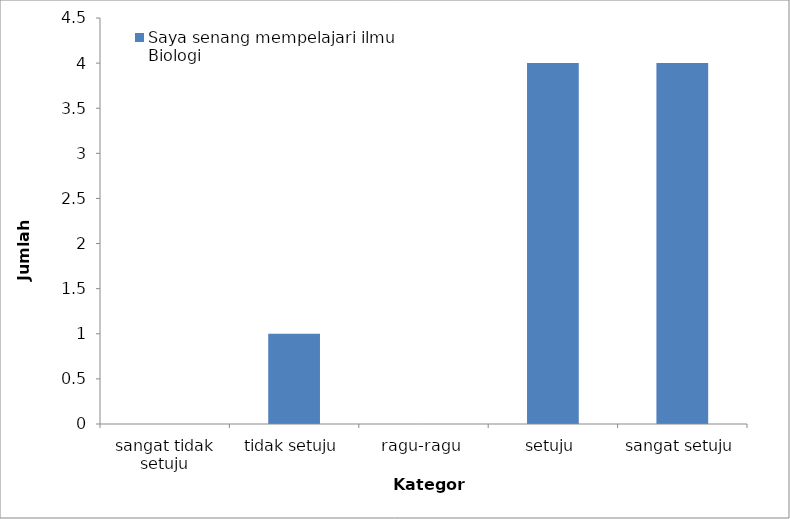
| Category | Saya senang mempelajari ilmu Biologi |
|---|---|
| sangat tidak setuju | 0 |
| tidak setuju | 1 |
| ragu-ragu | 0 |
| setuju | 4 |
| sangat setuju | 4 |